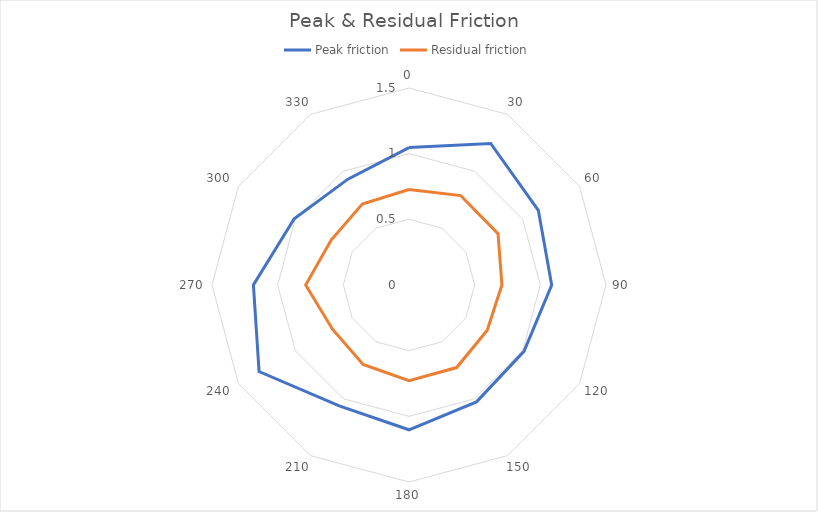
| Category | Peak friction | Residual friction |
|---|---|---|
| 0 | 1.046 | 0.727 |
| 1 | 1.244 | 0.786 |
| 2 | 1.137 | 0.783 |
| 3 | 1.086 | 0.708 |
| 4 | 1.011 | 0.688 |
| 5 | 1.028 | 0.726 |
| 6 | 1.102 | 0.728 |
| 7 | 1.062 | 0.699 |
| 8 | 1.318 | 0.673 |
| 9 | 1.185 | 0.787 |
| 10 | 1.009 | 0.684 |
| 11 | 0.931 | 0.711 |